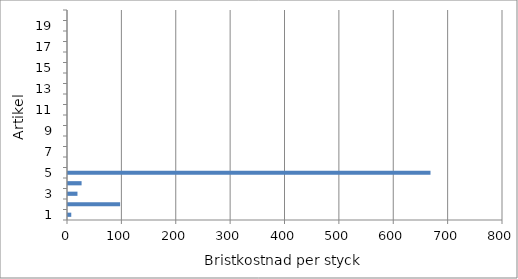
| Category | Series 0 |
|---|---|
| 0 | 6 |
| 1 | 95.833 |
| 2 | 17.4 |
| 3 | 25 |
| 4 | 666.667 |
| 5 | 0 |
| 6 | 0 |
| 7 | 0 |
| 8 | 0 |
| 9 | 0 |
| 10 | 0 |
| 11 | 0 |
| 12 | 0 |
| 13 | 0 |
| 14 | 0 |
| 15 | 0 |
| 16 | 0 |
| 17 | 0 |
| 18 | 0 |
| 19 | 0 |